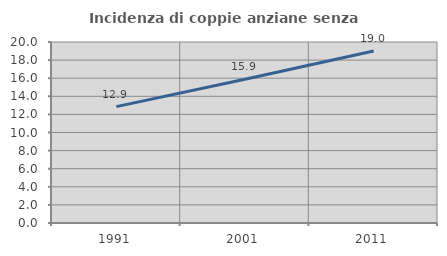
| Category | Incidenza di coppie anziane senza figli  |
|---|---|
| 1991.0 | 12.856 |
| 2001.0 | 15.881 |
| 2011.0 | 19.003 |